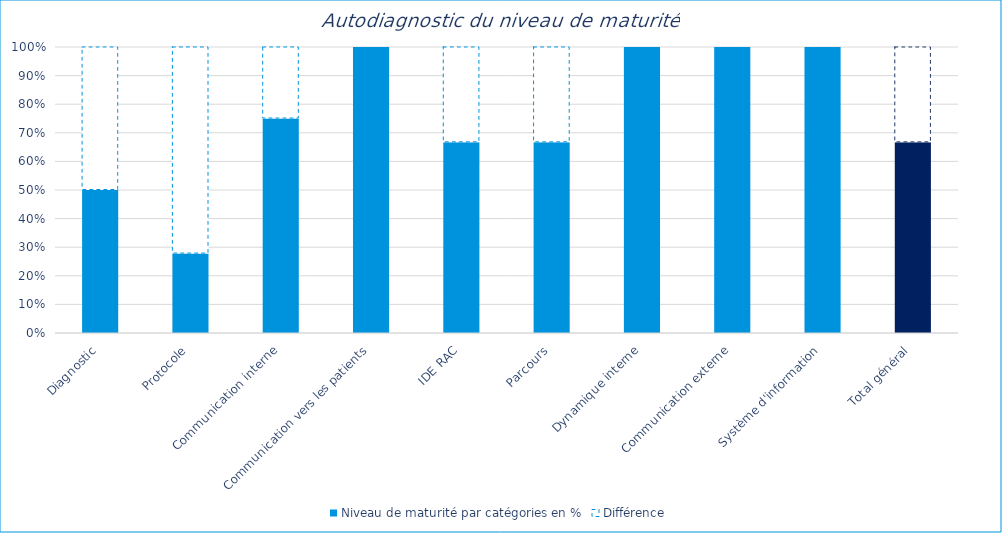
| Category | Niveau de maturité par catégories en % | Différence |
|---|---|---|
| Diagnostic | 0.5 | 0.5 |
| Protocole | 0.278 | 0.722 |
| Communication interne | 0.75 | 0.25 |
| Communication vers les patients | 1 | 0 |
| IDE RAC | 0.667 | 0.333 |
| Parcours | 0.667 | 0.333 |
| Dynamique interne | 1 | 0 |
| Communication externe | 1 | 0 |
| Système d'information | 1 | 0 |
| Total général | 0.667 | 0.333 |